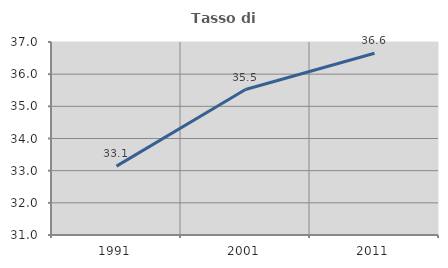
| Category | Tasso di occupazione   |
|---|---|
| 1991.0 | 33.142 |
| 2001.0 | 35.523 |
| 2011.0 | 36.65 |